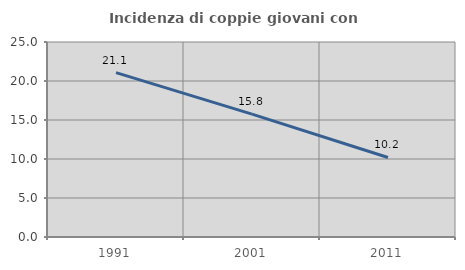
| Category | Incidenza di coppie giovani con figli |
|---|---|
| 1991.0 | 21.072 |
| 2001.0 | 15.76 |
| 2011.0 | 10.198 |